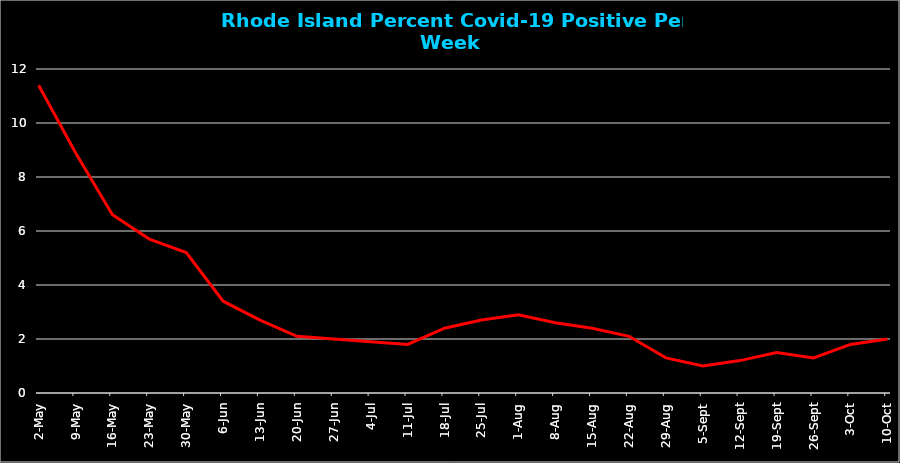
| Category | %Pos |
|---|---|
| 2020-05-02 | 11.4 |
| 2020-05-09 | 8.9 |
| 2020-05-16 | 6.6 |
| 2020-05-23 | 5.7 |
| 2020-05-30 | 5.2 |
| 2020-06-06 | 3.4 |
| 2020-06-13 | 2.7 |
| 2020-06-20 | 2.1 |
| 2020-06-27 | 2 |
| 2020-07-04 | 1.9 |
| 2020-07-11 | 1.8 |
| 2020-07-18 | 2.4 |
| 2020-07-25 | 2.7 |
| 2020-08-01 | 2.9 |
| 2020-08-08 | 2.6 |
| 2020-08-15 | 2.4 |
| 2020-08-22 | 2.1 |
| 2020-08-29 | 1.3 |
| 2020-09-05 | 1 |
| 2020-09-12 | 1.2 |
| 2020-09-19 | 1.5 |
| 2020-09-26 | 1.3 |
| 2020-10-03 | 1.8 |
| 2020-10-10 | 2 |